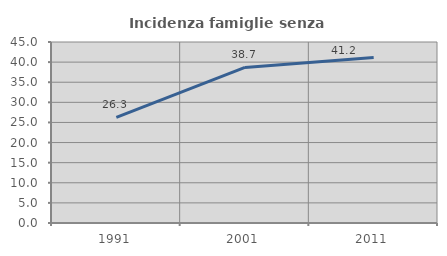
| Category | Incidenza famiglie senza nuclei |
|---|---|
| 1991.0 | 26.25 |
| 2001.0 | 38.676 |
| 2011.0 | 41.156 |